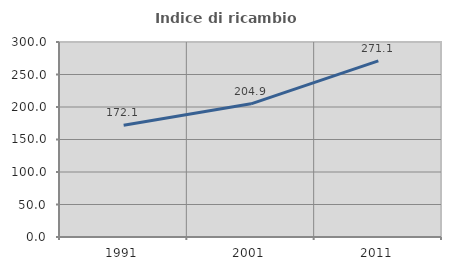
| Category | Indice di ricambio occupazionale  |
|---|---|
| 1991.0 | 172.063 |
| 2001.0 | 204.865 |
| 2011.0 | 271.053 |